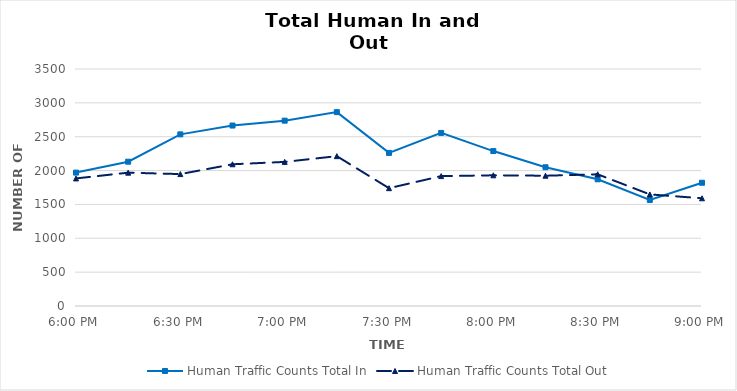
| Category | Human Traffic Counts Total In | Human Traffic Counts Total Out |
|---|---|---|
| 0.75 | 1970 | 1884 |
| 0.7604166666666666 | 2131 | 1969 |
| 0.7708333333333334 | 2535 | 1948 |
| 0.78125 | 2665 | 2093 |
| 0.7916666666666666 | 2737 | 2128 |
| 0.8020833333333334 | 2863 | 2213 |
| 0.8125 | 2261 | 1740 |
| 0.8229166666666666 | 2556 | 1918 |
| 0.8333333333333334 | 2288 | 1930 |
| 0.84375 | 2049 | 1924 |
| 0.8541666666666666 | 1871 | 1945 |
| 0.8645833333333334 | 1566 | 1648 |
| 0.875 | 1820 | 1591 |